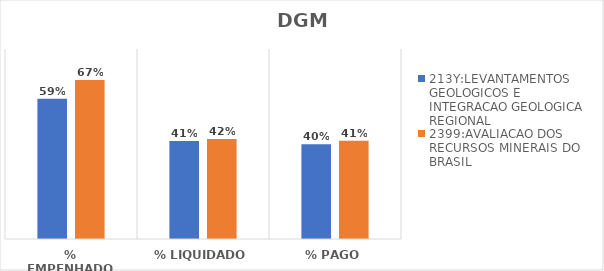
| Category | 213Y:LEVANTAMENTOS GEOLOGICOS E INTEGRACAO GEOLOGICA REGIONAL | 2399:AVALIACAO DOS RECURSOS MINERAIS DO BRASIL |
|---|---|---|
| % EMPENHADO | 0.591 | 0.67 |
| % LIQUIDADO | 0.412 | 0.421 |
| % PAGO | 0.399 | 0.413 |